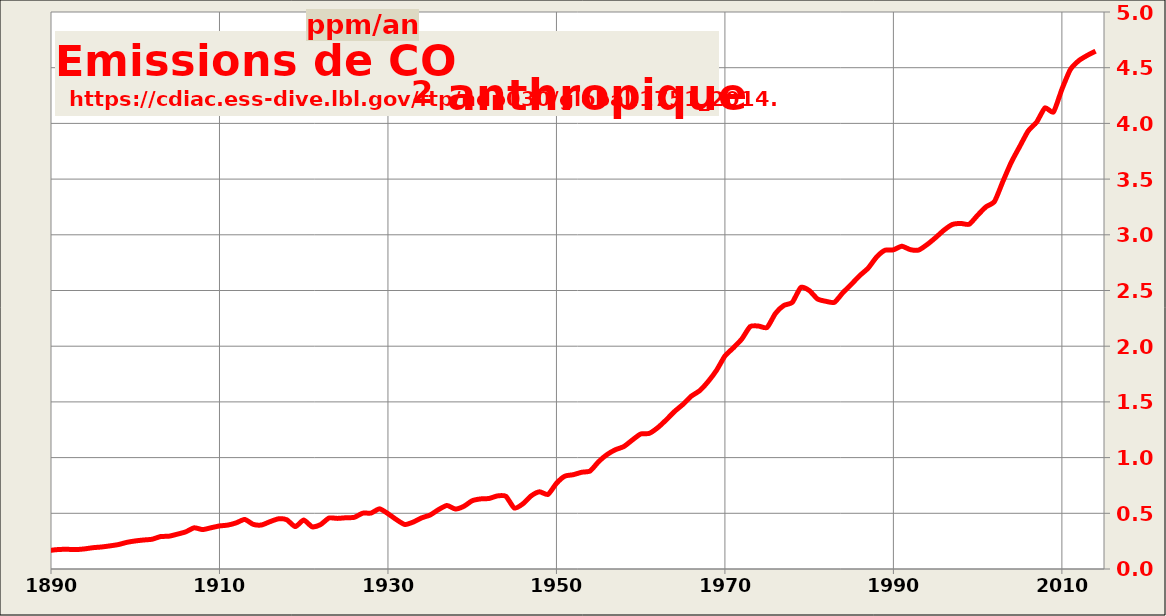
| Category |  Emissions annuelles (ppm/an) |
|---|---|
| 1751.0 | 0.001 |
| 1752.0 | 0.001 |
| 1753.0 | 0.001 |
| 1754.0 | 0.001 |
| 1755.0 | 0.001 |
| 1756.0 | 0.001 |
| 1757.0 | 0.001 |
| 1758.0 | 0.001 |
| 1759.0 | 0.001 |
| 1760.0 | 0.001 |
| 1761.0 | 0.001 |
| 1762.0 | 0.001 |
| 1763.0 | 0.001 |
| 1764.0 | 0.001 |
| 1765.0 | 0.001 |
| 1766.0 | 0.001 |
| 1767.0 | 0.001 |
| 1768.0 | 0.001 |
| 1769.0 | 0.001 |
| 1770.0 | 0.001 |
| 1771.0 | 0.002 |
| 1772.0 | 0.002 |
| 1773.0 | 0.002 |
| 1774.0 | 0.002 |
| 1775.0 | 0.002 |
| 1776.0 | 0.002 |
| 1777.0 | 0.002 |
| 1778.0 | 0.002 |
| 1779.0 | 0.002 |
| 1780.0 | 0.002 |
| 1781.0 | 0.002 |
| 1782.0 | 0.002 |
| 1783.0 | 0.002 |
| 1784.0 | 0.002 |
| 1785.0 | 0.002 |
| 1786.0 | 0.002 |
| 1787.0 | 0.002 |
| 1788.0 | 0.002 |
| 1789.0 | 0.002 |
| 1790.0 | 0.002 |
| 1791.0 | 0.003 |
| 1792.0 | 0.003 |
| 1793.0 | 0.003 |
| 1794.0 | 0.003 |
| 1795.0 | 0.003 |
| 1796.0 | 0.003 |
| 1797.0 | 0.003 |
| 1798.0 | 0.003 |
| 1799.0 | 0.003 |
| 1800.0 | 0.004 |
| 1801.0 | 0.004 |
| 1802.0 | 0.005 |
| 1803.0 | 0.004 |
| 1804.0 | 0.004 |
| 1805.0 | 0.004 |
| 1806.0 | 0.005 |
| 1807.0 | 0.005 |
| 1808.0 | 0.005 |
| 1809.0 | 0.005 |
| 1810.0 | 0.005 |
| 1811.0 | 0.005 |
| 1812.0 | 0.005 |
| 1813.0 | 0.005 |
| 1814.0 | 0.005 |
| 1815.0 | 0.006 |
| 1816.0 | 0.006 |
| 1817.0 | 0.007 |
| 1818.0 | 0.007 |
| 1819.0 | 0.007 |
| 1820.0 | 0.007 |
| 1821.0 | 0.007 |
| 1822.0 | 0.007 |
| 1823.0 | 0.008 |
| 1824.0 | 0.008 |
| 1825.0 | 0.008 |
| 1826.0 | 0.008 |
| 1827.0 | 0.008 |
| 1828.0 | 0.008 |
| 1829.0 | 0.008 |
| 1830.0 | 0.011 |
| 1831.0 | 0.011 |
| 1832.0 | 0.011 |
| 1833.0 | 0.011 |
| 1834.0 | 0.011 |
| 1835.0 | 0.012 |
| 1836.0 | 0.014 |
| 1837.0 | 0.014 |
| 1838.0 | 0.014 |
| 1839.0 | 0.015 |
| 1840.0 | 0.016 |
| 1841.0 | 0.016 |
| 1842.0 | 0.017 |
| 1843.0 | 0.017 |
| 1844.0 | 0.018 |
| 1845.0 | 0.02 |
| 1846.0 | 0.02 |
| 1847.0 | 0.022 |
| 1848.0 | 0.022 |
| 1849.0 | 0.024 |
| 1850.0 | 0.025 |
| 1851.0 | 0.025 |
| 1852.0 | 0.027 |
| 1853.0 | 0.028 |
| 1854.0 | 0.033 |
| 1855.0 | 0.033 |
| 1856.0 | 0.036 |
| 1857.0 | 0.036 |
| 1858.0 | 0.037 |
| 1859.0 | 0.039 |
| 1860.0 | 0.043 |
| 1861.0 | 0.045 |
| 1862.0 | 0.046 |
| 1863.0 | 0.049 |
| 1864.0 | 0.053 |
| 1865.0 | 0.056 |
| 1866.0 | 0.058 |
| 1867.0 | 0.061 |
| 1868.0 | 0.064 |
| 1869.0 | 0.067 |
| 1870.0 | 0.069 |
| 1871.0 | 0.074 |
| 1872.0 | 0.082 |
| 1873.0 | 0.087 |
| 1874.0 | 0.082 |
| 1875.0 | 0.089 |
| 1876.0 | 0.09 |
| 1877.0 | 0.092 |
| 1878.0 | 0.092 |
| 1879.0 | 0.099 |
| 1880.0 | 0.111 |
| 1881.0 | 0.115 |
| 1882.0 | 0.121 |
| 1883.0 | 0.128 |
| 1884.0 | 0.13 |
| 1885.0 | 0.131 |
| 1886.0 | 0.133 |
| 1887.0 | 0.139 |
| 1888.0 | 0.154 |
| 1889.0 | 0.154 |
| 1890.0 | 0.168 |
| 1891.0 | 0.175 |
| 1892.0 | 0.176 |
| 1893.0 | 0.175 |
| 1894.0 | 0.181 |
| 1895.0 | 0.192 |
| 1896.0 | 0.198 |
| 1897.0 | 0.208 |
| 1898.0 | 0.219 |
| 1899.0 | 0.239 |
| 1900.0 | 0.252 |
| 1901.0 | 0.26 |
| 1902.0 | 0.267 |
| 1903.0 | 0.291 |
| 1904.0 | 0.294 |
| 1905.0 | 0.313 |
| 1906.0 | 0.333 |
| 1907.0 | 0.37 |
| 1908.0 | 0.354 |
| 1909.0 | 0.37 |
| 1910.0 | 0.386 |
| 1911.0 | 0.394 |
| 1912.0 | 0.415 |
| 1913.0 | 0.445 |
| 1914.0 | 0.401 |
| 1915.0 | 0.395 |
| 1916.0 | 0.425 |
| 1917.0 | 0.45 |
| 1918.0 | 0.442 |
| 1919.0 | 0.38 |
| 1920.0 | 0.44 |
| 1921.0 | 0.379 |
| 1922.0 | 0.399 |
| 1923.0 | 0.458 |
| 1924.0 | 0.454 |
| 1925.0 | 0.46 |
| 1926.0 | 0.464 |
| 1927.0 | 0.501 |
| 1928.0 | 0.502 |
| 1929.0 | 0.54 |
| 1930.0 | 0.497 |
| 1931.0 | 0.443 |
| 1932.0 | 0.4 |
| 1933.0 | 0.421 |
| 1934.0 | 0.459 |
| 1935.0 | 0.484 |
| 1936.0 | 0.533 |
| 1937.0 | 0.57 |
| 1938.0 | 0.539 |
| 1939.0 | 0.562 |
| 1940.0 | 0.613 |
| 1941.0 | 0.629 |
| 1942.0 | 0.633 |
| 1943.0 | 0.656 |
| 1944.0 | 0.652 |
| 1945.0 | 0.547 |
| 1946.0 | 0.584 |
| 1947.0 | 0.657 |
| 1948.0 | 0.693 |
| 1949.0 | 0.669 |
| 1950.0 | 0.769 |
| 1951.0 | 0.833 |
| 1952.0 | 0.847 |
| 1953.0 | 0.868 |
| 1954.0 | 0.88 |
| 1955.0 | 0.963 |
| 1956.0 | 1.027 |
| 1957.0 | 1.071 |
| 1958.0 | 1.099 |
| 1959.0 | 1.158 |
| 1960.0 | 1.212 |
| 1961.0 | 1.217 |
| 1962.0 | 1.267 |
| 1963.0 | 1.336 |
| 1964.0 | 1.413 |
| 1965.0 | 1.476 |
| 1966.0 | 1.551 |
| 1967.0 | 1.6 |
| 1968.0 | 1.682 |
| 1969.0 | 1.783 |
| 1970.0 | 1.912 |
| 1971.0 | 1.985 |
| 1972.0 | 2.064 |
| 1973.0 | 2.176 |
| 1974.0 | 2.181 |
| 1975.0 | 2.168 |
| 1976.0 | 2.294 |
| 1977.0 | 2.366 |
| 1978.0 | 2.393 |
| 1979.0 | 2.527 |
| 1980.0 | 2.5 |
| 1981.0 | 2.424 |
| 1982.0 | 2.403 |
| 1983.0 | 2.394 |
| 1984.0 | 2.48 |
| 1985.0 | 2.555 |
| 1986.0 | 2.633 |
| 1987.0 | 2.7 |
| 1988.0 | 2.8 |
| 1989.0 | 2.861 |
| 1990.0 | 2.865 |
| 1991.0 | 2.897 |
| 1992.0 | 2.867 |
| 1993.0 | 2.863 |
| 1994.0 | 2.912 |
| 1995.0 | 2.974 |
| 1996.0 | 3.042 |
| 1997.0 | 3.092 |
| 1998.0 | 3.102 |
| 1999.0 | 3.095 |
| 2000.0 | 3.176 |
| 2001.0 | 3.251 |
| 2002.0 | 3.299 |
| 2003.0 | 3.479 |
| 2004.0 | 3.652 |
| 2005.0 | 3.793 |
| 2006.0 | 3.932 |
| 2007.0 | 4.011 |
| 2008.0 | 4.14 |
| 2009.0 | 4.102 |
| 2010.0 | 4.306 |
| 2011.0 | 4.483 |
| 2012.0 | 4.563 |
| 2013.0 | 4.61 |
| 2014.0 | 4.649 |